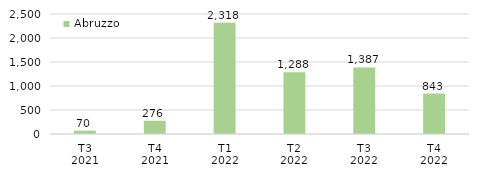
| Category | Abruzzo |
|---|---|
| T3
2021 | 69.533 |
| T4
2021 | 275.728 |
| T1
2022 | 2317.767 |
| T2
2022 | 1288.209 |
| T3
2022 | 1386.533 |
| T4
2022 | 842.902 |